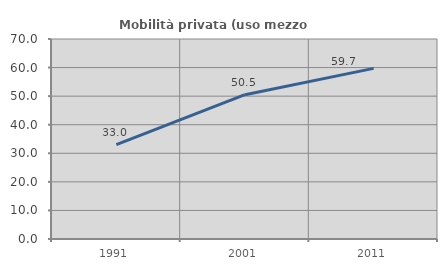
| Category | Mobilità privata (uso mezzo privato) |
|---|---|
| 1991.0 | 33.021 |
| 2001.0 | 50.517 |
| 2011.0 | 59.729 |